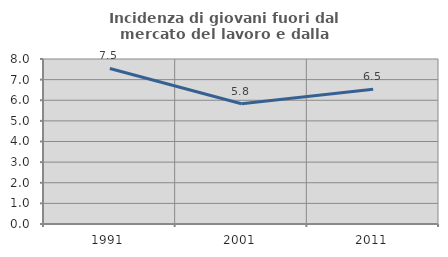
| Category | Incidenza di giovani fuori dal mercato del lavoro e dalla formazione  |
|---|---|
| 1991.0 | 7.54 |
| 2001.0 | 5.828 |
| 2011.0 | 6.53 |